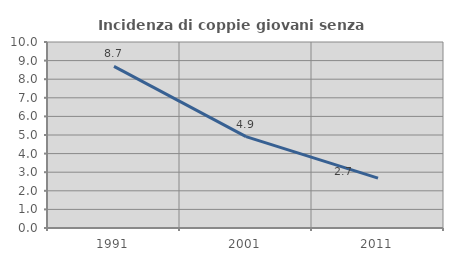
| Category | Incidenza di coppie giovani senza figli |
|---|---|
| 1991.0 | 8.689 |
| 2001.0 | 4.91 |
| 2011.0 | 2.681 |